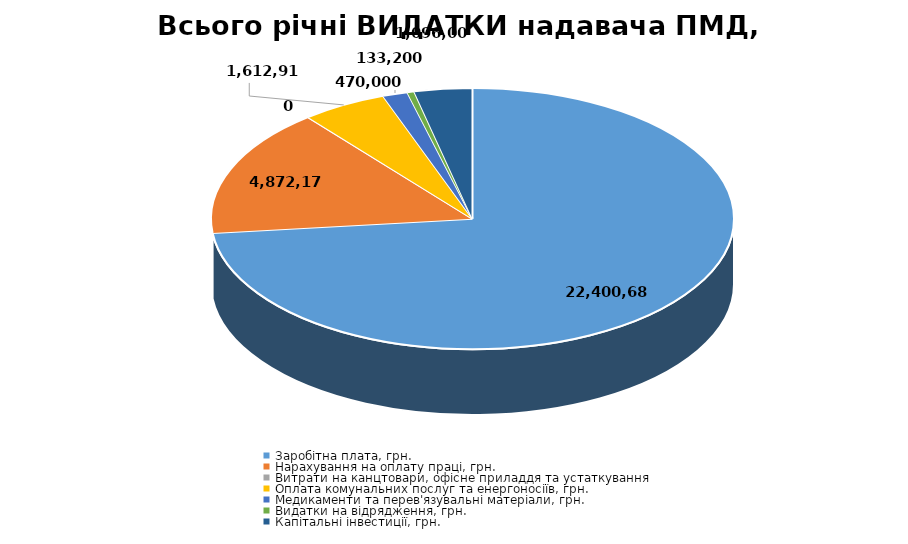
| Category | Всього річні ВИДАТКИ надавача ПМД, грн. |
|---|---|
| Заробітна плата, грн. | 22400685 |
| Нарахування на оплату праці, грн. | 4872173.1 |
| Витрати на канцтовари, офісне приладдя та устаткування  | 0 |
| Оплата комунальних послуг та енергоносіїв, грн. | 1612915.271 |
| Медикаменти та перев'язувальні матеріали, грн. | 470000 |
| Видатки на відрядження, грн. | 133200 |
| Капітальні інвестиції, грн. | 1096000 |